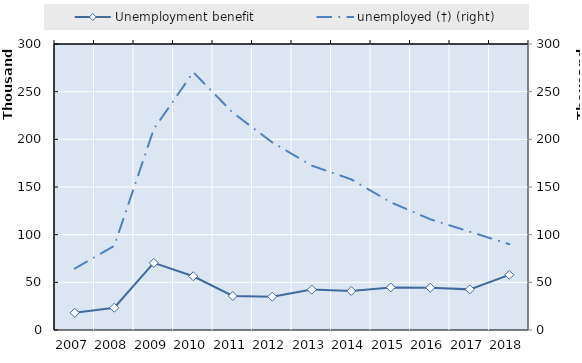
| Category | Series 4 | Series 5 | Series 6 | Series 7 | Series 8 | Series 9 | Series 10 | Series 11 | Series 12 | Series 13 | Series 14 | Series 15 | Series 16 | Series 17 | Series 18 | Series 19 | Unemployment benefit |
|---|---|---|---|---|---|---|---|---|---|---|---|---|---|---|---|---|---|
| 2007.0 |  |  |  |  |  |  |  |  |  |  |  |  |  |  |  |  | 18036 |
| 2008.0 |  |  |  |  |  |  |  |  |  |  |  |  |  |  |  |  | 23367 |
| 2009.0 |  |  |  |  |  |  |  |  |  |  |  |  |  |  |  |  | 70362 |
| 2010.0 |  |  |  |  |  |  |  |  |  |  |  |  |  |  |  |  | 56376 |
| 2011.0 |  |  |  |  |  |  |  |  |  |  |  |  |  |  |  |  | 35653 |
| 2012.0 |  |  |  |  |  |  |  |  |  |  |  |  |  |  |  |  | 35007 |
| 2013.0 |  |  |  |  |  |  |  |  |  |  |  |  |  |  |  |  | 42400 |
| 2014.0 |  |  |  |  |  |  |  |  |  |  |  |  |  |  |  |  | 40900 |
| 2015.0 |  |  |  |  |  |  |  |  |  |  |  |  |  |  |  |  | 44669 |
| 2016.0 |  |  |  |  |  |  |  |  |  |  |  |  |  |  |  |  | 44292 |
| 2017.0 |  |  |  |  |  |  |  |  |  |  |  |  |  |  |  |  | 42616 |
| 2018.0 |  |  |  |  |  |  |  |  |  |  |  |  |  |  |  |  | 57854 |